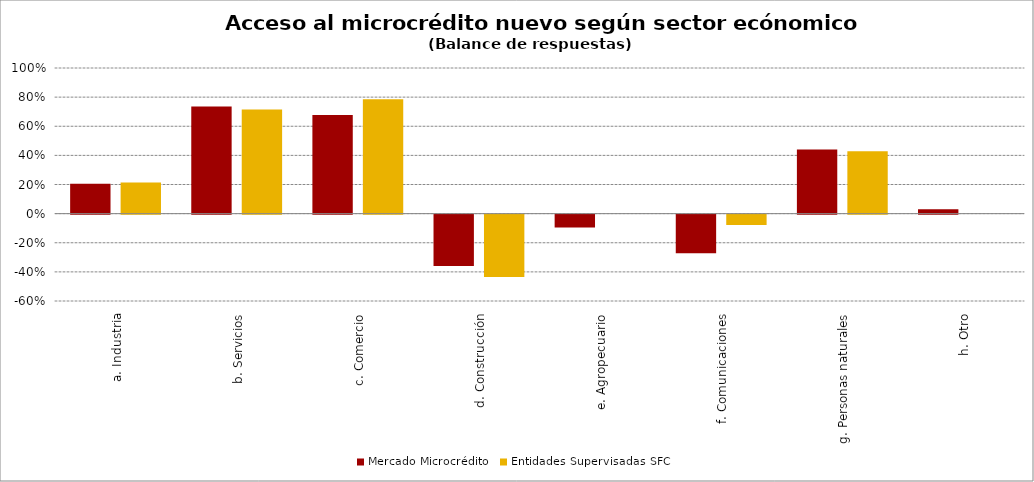
| Category | Mercado Microcrédito | Entidades Supervisadas SFC |
|---|---|---|
| a. Industria | 0.206 | 0.214 |
| b. Servicios | 0.735 | 0.714 |
| c. Comercio | 0.676 | 0.786 |
| d. Construcción | -0.353 | -0.429 |
| e. Agropecuario | -0.088 | 0 |
| f. Comunicaciones | -0.265 | -0.071 |
| g. Personas naturales | 0.441 | 0.429 |
| h. Otro | 0.029 | 0 |